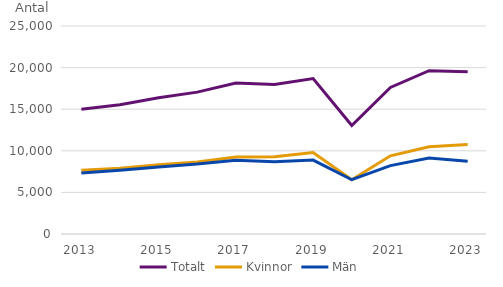
| Category | Totalt | Kvinnor | Män |
|---|---|---|---|
| 2013.0 | 14992 | 7669 | 7323 |
| 2014.0 | 15540 | 7892 | 7648 |
| 2015.0 | 16384 | 8332 | 8052 |
| 2016.0 | 17051 | 8648 | 8403 |
| 2017.0 | 18139 | 9268 | 8871 |
| 2018.0 | 17974 | 9280 | 8694 |
| 2019.0 | 18688 | 9803 | 8885 |
| 2020.0 | 13036 | 6513 | 6523 |
| 2021.0 | 17619 | 9396 | 8223 |
| 2022.0 | 19624 | 10496 | 9128 |
| 2023.0 | 19499 | 10745 | 8754 |